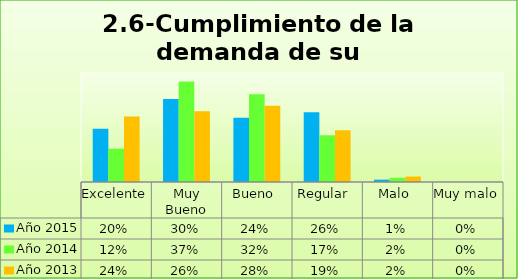
| Category | Año 2015 | Año 2014 | Año 2013 |
|---|---|---|---|
| Excelente | 0.195 | 0.122 | 0.24 |
| Muy Bueno | 0.305 | 0.369 | 0.26 |
| Bueno  | 0.236 | 0.322 | 0.28 |
| Regular  | 0.256 | 0.171 | 0.19 |
| Malo  | 0.009 | 0.016 | 0.02 |
| Muy malo  | 0 | 0 | 0 |